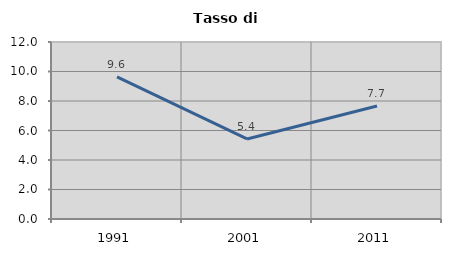
| Category | Tasso di disoccupazione   |
|---|---|
| 1991.0 | 9.633 |
| 2001.0 | 5.427 |
| 2011.0 | 7.656 |